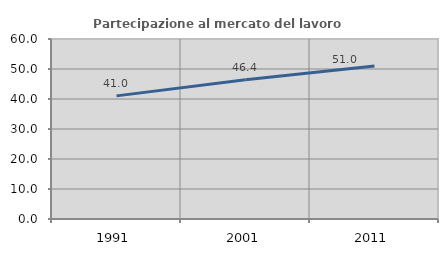
| Category | Partecipazione al mercato del lavoro  femminile |
|---|---|
| 1991.0 | 41.044 |
| 2001.0 | 46.42 |
| 2011.0 | 50.975 |